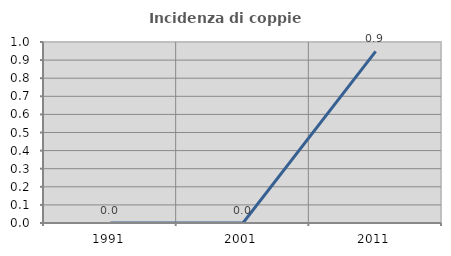
| Category | Incidenza di coppie miste |
|---|---|
| 1991.0 | 0 |
| 2001.0 | 0 |
| 2011.0 | 0.948 |